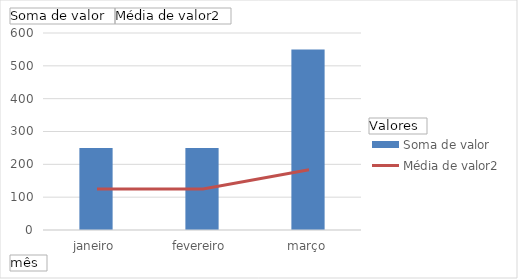
| Category | Soma de valor |
|---|---|
| janeiro | 250 |
| fevereiro | 250 |
| março | 550 |